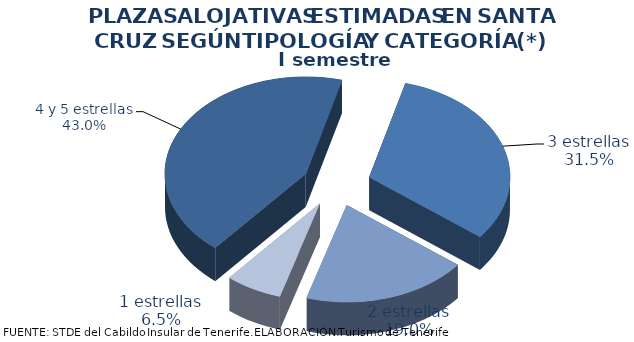
| Category | I semestre 2013 |
|---|---|
| 4 y 5 estrellas | 0.43 |
| 3 estrellas | 0.315 |
| 2 estrellas | 0.19 |
| 1 estrellas | 0.065 |